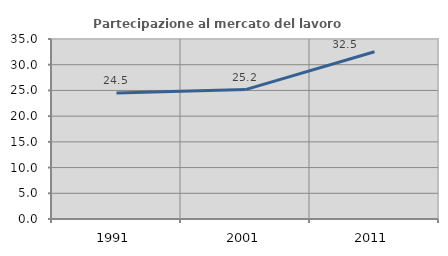
| Category | Partecipazione al mercato del lavoro  femminile |
|---|---|
| 1991.0 | 24.478 |
| 2001.0 | 25.163 |
| 2011.0 | 32.512 |